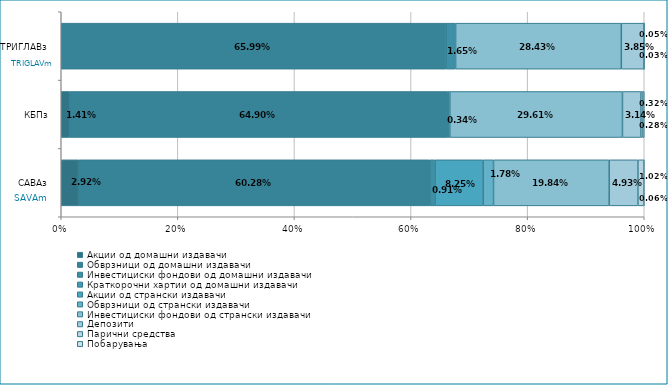
| Category | Акции од домашни издавачи  | Обврзници од домашни издавачи  | Инвестициски фондови од домашни издавачи  | Краткорочни хартии од домашни издавачи  | Акции од странски издавачи  | Обврзници од странски издавачи  | Инвестициски фондови од странски издавaчи | Депозити  | Парични средства  | Побарувања |
|---|---|---|---|---|---|---|---|---|---|---|
| САВАз | 0.029 | 0.603 | 0.009 | 0 | 0.083 | 0.018 | 0.198 | 0.049 | 0.01 | 0.001 |
| КБПз | 0.014 | 0.649 | 0.003 | 0 | 0 | 0 | 0.296 | 0.031 | 0.003 | 0.003 |
| ТРИГЛАВз | 0 | 0.66 | 0.017 | 0 | 0 | 0 | 0.284 | 0.038 | 0.001 | 0 |